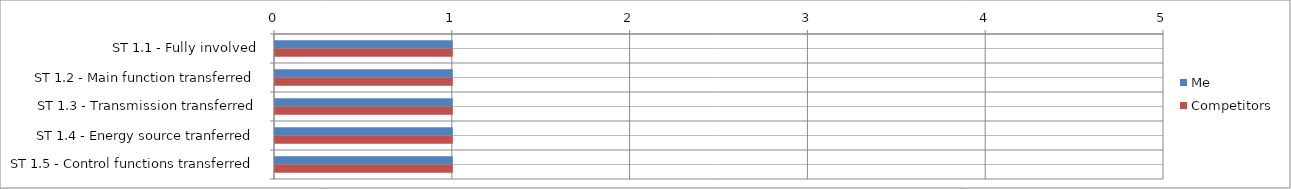
| Category | Me | Competitors |
|---|---|---|
| ST 1.1 - Fully involved | 1 | 1 |
| ST 1.2 - Main function transferred | 1 | 1 |
| ST 1.3 - Transmission transferred | 1 | 1 |
| ST 1.4 - Energy source tranferred | 1 | 1 |
| ST 1.5 - Control functions transferred | 1 | 1 |